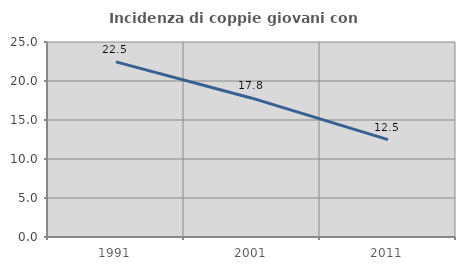
| Category | Incidenza di coppie giovani con figli |
|---|---|
| 1991.0 | 22.456 |
| 2001.0 | 17.796 |
| 2011.0 | 12.478 |